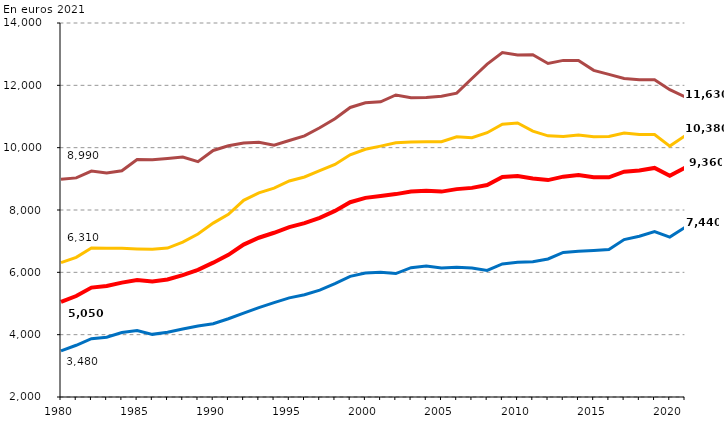
| Category | Dépense moyenne par élève | Dépense moyenne pour un élève du 1er degré | Dépense moyenne pour un élève du 2d degré | Dépense moyenne pour un élève du supérieur |
|---|---|---|---|---|
| 1980 | 5050 | 3480 | 6310 | 8990 |
| 1981 | 5240 | 3660 | 6480 | 9030 |
| 1982 | 5510 | 3870 | 6780 | 9250 |
| 1983 | 5560 | 3920 | 6770 | 9190 |
| 1984 | 5670 | 4070 | 6770 | 9260 |
| 1985 | 5750 | 4130 | 6750 | 9620 |
| 1986 | 5710 | 4010 | 6740 | 9610 |
| 1987 | 5770 | 4080 | 6780 | 9650 |
| 1988 | 5910 | 4180 | 6970 | 9700 |
| 1989 | 6080 | 4280 | 7230 | 9550 |
| 1990 | 6310 | 4350 | 7580 | 9910 |
| 1991 | 6560 | 4510 | 7860 | 10060 |
| 1992 | 6890 | 4690 | 8310 | 10150 |
| 1993 | 7110 | 4870 | 8550 | 10170 |
| 1994 | 7270 | 5030 | 8700 | 10080 |
| 1995 | 7450 | 5180 | 8930 | 10230 |
| 1996 | 7580 | 5280 | 9060 | 10380 |
| 1997 | 7750 | 5430 | 9260 | 10640 |
| 1998 | 7970 | 5640 | 9460 | 10930 |
| 1999 | 8250 | 5870 | 9770 | 11290 |
| 2000 | 8390 | 5980 | 9950 | 11440 |
| 2001 | 8450 | 6000 | 10050 | 11470 |
| 2002 | 8510 | 5960 | 10160 | 11690 |
| 2003 | 8590 | 6150 | 10180 | 11600 |
| 2004 | 8620 | 6200 | 10190 | 11610 |
| 2005 | 8590 | 6140 | 10190 | 11650 |
| 2006 | 8670 | 6160 | 10350 | 11750 |
| 2007 | 8710 | 6140 | 10320 | 12220 |
| 2008 | 8800 | 6060 | 10480 | 12680 |
| 2009 | 9060 | 6270 | 10750 | 13050 |
| 2010 | 9090 | 6320 | 10790 | 12970 |
| 2011 | 9010 | 6340 | 10530 | 12980 |
| 2012 | 8960 | 6430 | 10380 | 12700 |
| 2013 | 9070 | 6640 | 10360 | 12800 |
| 2014 | 9120 | 6680 | 10410 | 12800 |
| 2015 | 9050 | 6700 | 10350 | 12480 |
| 2016 | 9050 | 6730 | 10360 | 12350 |
| 2017 | 9230 | 7050 | 10470 | 12220 |
| 2018 | 9270 | 7160 | 10420 | 12180 |
| 2019 | 9350 | 7310 | 10420 | 12180 |
| 2020 | 9100 | 7130 | 10050 | 11860 |
| 2021p | 9360 | 7440 | 10380 | 11630 |